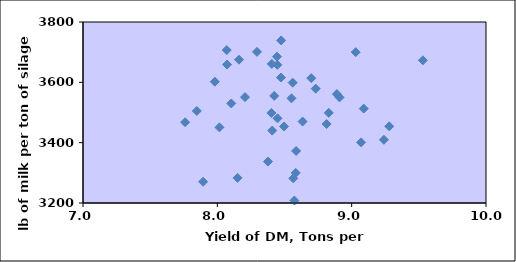
| Category | Series 0 |
|---|---|
| 8.55197193 | 3547 |
| 8.44776089 | 3480.75 |
| 9.94 | 3178.5 |
| 9.01 | 3018 |
| 8.89 | 3561 |
| 8.44692323 | 3658 |
| 8.06985429 | 3707 |
| 8.91 | 3550 |
| 7.76010175 | 3467.75 |
| 9.03 | 3700 |
| 8.82974929 | 3499 |
| 8.40242996 | 3498.5 |
| 8.73235947 | 3579 |
| 8.57340808 | 3208 |
| 8.58354471 | 3299.75 |
| 8.01552496 | 3450.75 |
| 8.07233823 | 3659 |
| 9.07 | 3401 |
| 8.40555439 | 3661 |
| 9.24 | 3409.5 |
| 8.376756 | 3337.25 |
| 8.2060551 | 3551 |
| 9.53 | 3673 |
| 8.42337727 | 3555 |
| 8.6347845 | 3470 |
| 9.09 | 3513 |
| 9.28 | 3454.25 |
| 8.49644012 | 3453.75 |
| 8.10362234 | 3530 |
| 8.58640683 | 3372.5 |
| 7.89417816 | 3270.5 |
| 8.16131071 | 3675 |
| 8.56548315 | 3281.75 |
| 8.40870013 | 3440.25 |
| 8.47331404 | 3616 |
| 8.44393452 | 3685 |
| 7.84707742 | 3505 |
| 8.69920958 | 3614 |
| 7.98140321 | 3602 |
| 8.15045129 | 3283.25 |
| 8.81337613 | 3461.75 |
| 8.29537473 | 3701 |
| 8.47499798 | 3739 |
| 8.56058857 | 3599 |
| 9.32 | 2978 |